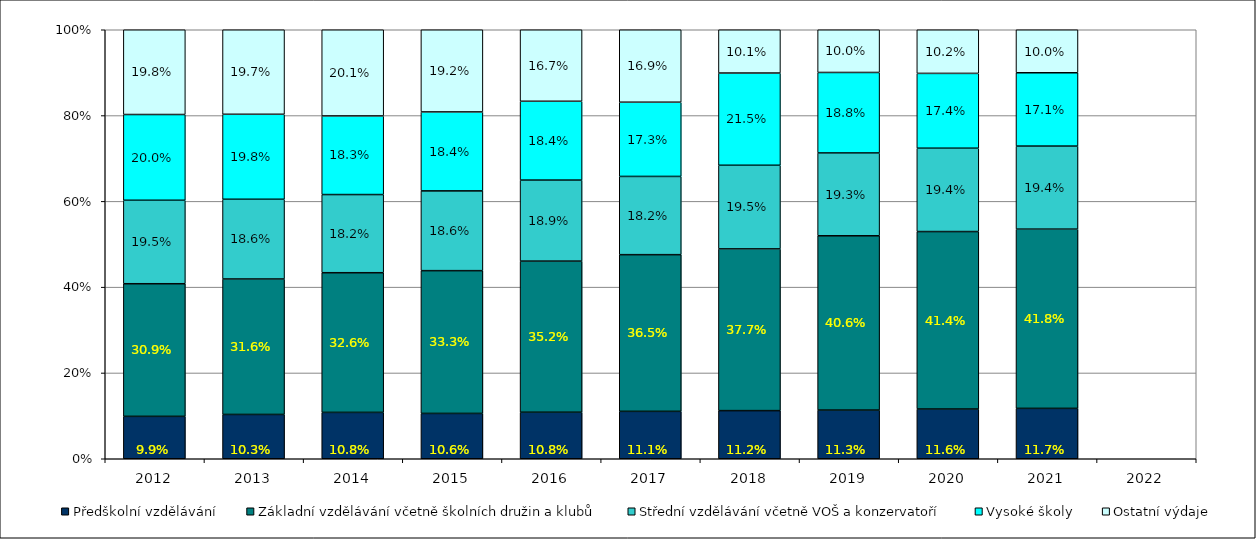
| Category | Předškolní vzdělávání | Základní vzdělávání včetně školních družin a klubů | Střední vzdělávání včetně VOŠ a konzervatoří | Vysoké školy | Ostatní výdaje |
|---|---|---|---|---|---|
| 2012.0 | 0.099 | 0.309 | 0.195 | 0.2 | 0.198 |
| 2013.0 | 0.103 | 0.316 | 0.186 | 0.198 | 0.197 |
| 2014.0 | 0.108 | 0.326 | 0.182 | 0.183 | 0.201 |
| 2015.0 | 0.106 | 0.333 | 0.186 | 0.184 | 0.192 |
| 2016.0 | 0.108 | 0.352 | 0.189 | 0.184 | 0.167 |
| 2017.0 | 0.111 | 0.365 | 0.182 | 0.173 | 0.169 |
| 2018.0 | 0.112 | 0.377 | 0.195 | 0.215 | 0.101 |
| 2019.0 | 0.113 | 0.406 | 0.193 | 0.188 | 0.1 |
| 2020.0 | 0.116 | 0.414 | 0.194 | 0.174 | 0.102 |
| 2021.0 | 0.117 | 0.418 | 0.194 | 0.171 | 0.1 |
| 2022.0 | 0 | 0 | 0 | 0 | 0 |